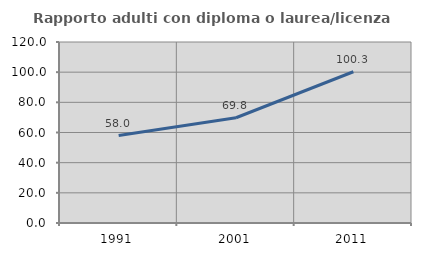
| Category | Rapporto adulti con diploma o laurea/licenza media  |
|---|---|
| 1991.0 | 57.996 |
| 2001.0 | 69.79 |
| 2011.0 | 100.279 |